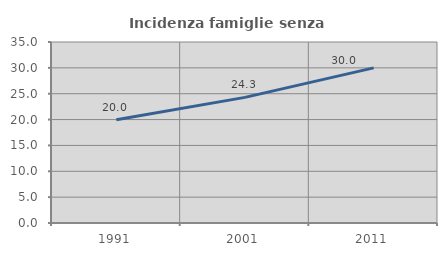
| Category | Incidenza famiglie senza nuclei |
|---|---|
| 1991.0 | 19.954 |
| 2001.0 | 24.288 |
| 2011.0 | 29.994 |